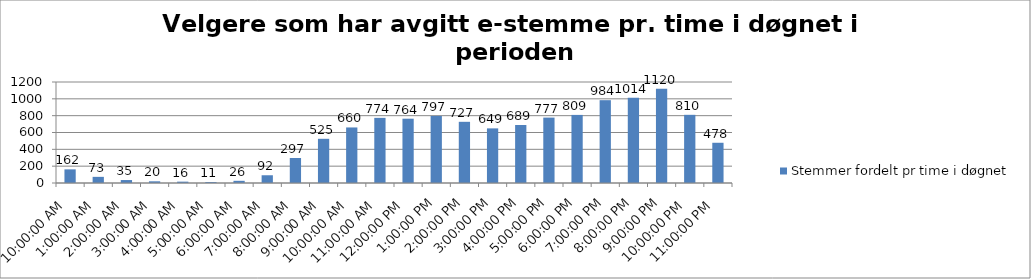
| Category | Stemmer fordelt pr time i døgnet |
|---|---|
| 0.0 | 162 |
| 0.0416666666666667 | 73 |
| 0.0833333333333333 | 35 |
| 0.125 | 20 |
| 0.166666666666667 | 16 |
| 0.208333333333333 | 11 |
| 0.25 | 26 |
| 0.291666666666667 | 92 |
| 0.333333333333333 | 297 |
| 0.375 | 525 |
| 0.416666666666667 | 660 |
| 0.458333333333333 | 774 |
| 0.5 | 764 |
| 0.541666666666667 | 797 |
| 0.583333333333333 | 727 |
| 0.625 | 649 |
| 0.666666666666667 | 689 |
| 0.708333333333333 | 777 |
| 0.75 | 809 |
| 0.791666666666667 | 984 |
| 0.833333333333333 | 1014 |
| 0.875 | 1120 |
| 0.916666666666667 | 810 |
| 0.958333333333333 | 478 |